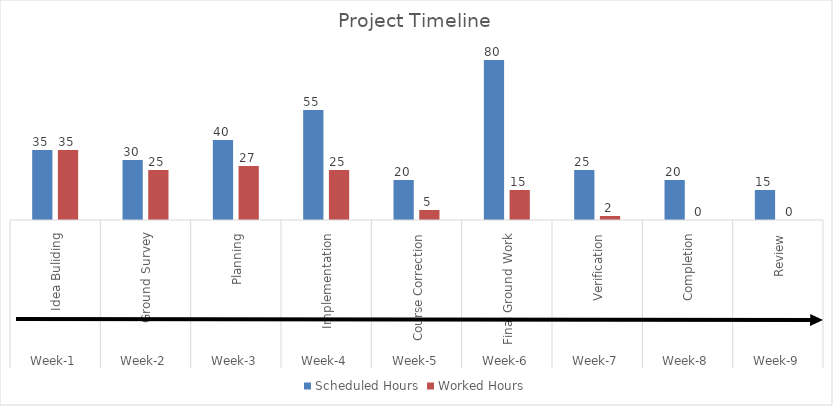
| Category | Scheduled Hours | Worked Hours |
|---|---|---|
| 0 | 35 | 35 |
| 1 | 30 | 25 |
| 2 | 40 | 27 |
| 3 | 55 | 25 |
| 4 | 20 | 5 |
| 5 | 80 | 15 |
| 6 | 25 | 2 |
| 7 | 20 | 0 |
| 8 | 15 | 0 |